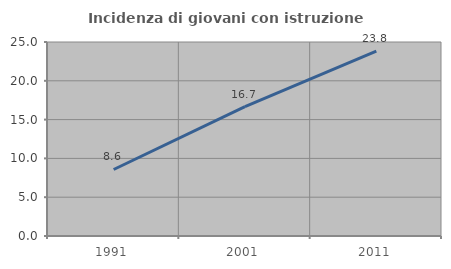
| Category | Incidenza di giovani con istruzione universitaria |
|---|---|
| 1991.0 | 8.571 |
| 2001.0 | 16.667 |
| 2011.0 | 23.81 |